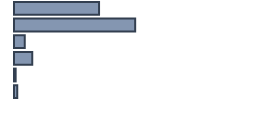
| Category | Percentatge |
|---|---|
| 0 | 35.435 |
| 1 | 50.488 |
| 2 | 4.49 |
| 3 | 7.558 |
| 4 | 0.686 |
| 5 | 1.343 |